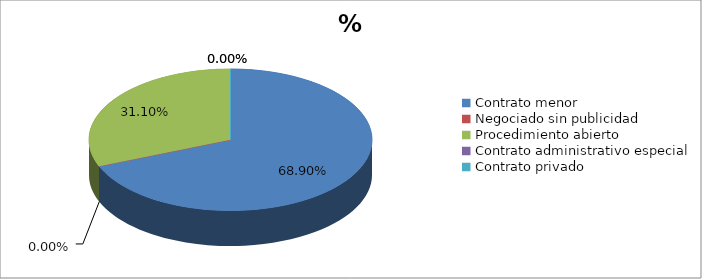
| Category | % volumen |
|---|---|
| Contrato menor | 0.689 |
| Negociado sin publicidad | 0 |
| Procedimiento abierto | 0.311 |
| Contrato administrativo especial | 0 |
| Contrato privado | 0 |